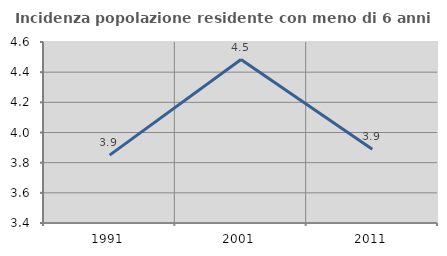
| Category | Incidenza popolazione residente con meno di 6 anni |
|---|---|
| 1991.0 | 3.85 |
| 2001.0 | 4.484 |
| 2011.0 | 3.889 |